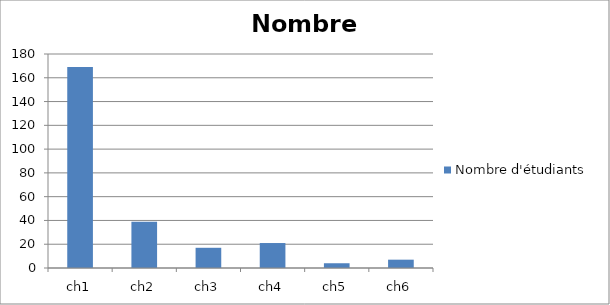
| Category | Nombre d'étudiants  |
|---|---|
| ch1 | 169 |
| ch2 | 39 |
| ch3 | 17 |
| ch4 | 21 |
| ch5 | 4 |
| ch6 | 7 |